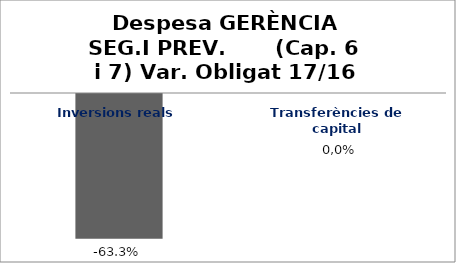
| Category | Series 0 |
|---|---|
| Inversions reals | -0.633 |
| Transferències de capital | 0 |